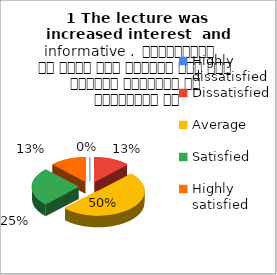
| Category | 1 The lecture was  increased interest  and informative .  व्याख्यान से रुचि में वृद्धि हुई एवं शिक्षण जानकारी से परिपूर्ण था |
|---|---|
| Highly dissatisfied | 0 |
| Dissatisfied | 1 |
| Average | 4 |
| Satisfied | 2 |
| Highly satisfied | 1 |